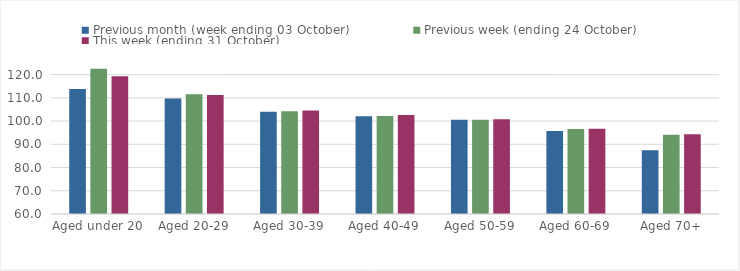
| Category | Previous month (week ending 03 October) | Previous week (ending 24 October) | This week (ending 31 October) |
|---|---|---|---|
| Aged under 20 | 113.79 | 122.56 | 119.32 |
| Aged 20-29 | 109.67 | 111.56 | 111.24 |
| Aged 30-39 | 104.03 | 104.18 | 104.57 |
| Aged 40-49 | 102.04 | 102.18 | 102.57 |
| Aged 50-59 | 100.59 | 100.6 | 100.76 |
| Aged 60-69 | 95.73 | 96.58 | 96.67 |
| Aged 70+ | 87.44 | 94.08 | 94.32 |